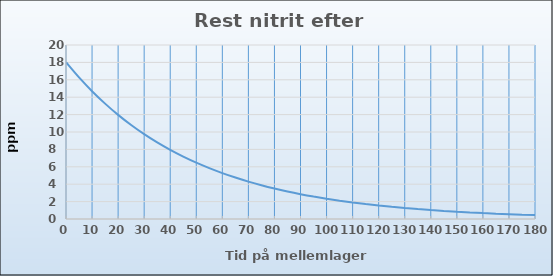
| Category | Series 0 |
|---|---|
| 0.0 | 18.028 |
| 5.0 | 16.273 |
| 10.0 | 14.69 |
| 15.0 | 13.26 |
| 20.0 | 11.97 |
| 25.0 | 10.805 |
| 30.0 | 9.754 |
| 35.0 | 8.805 |
| 40.0 | 7.948 |
| 45.0 | 7.175 |
| 50.0 | 6.476 |
| 55.0 | 5.846 |
| 60.0 | 5.277 |
| 65.0 | 4.764 |
| 70.0 | 4.3 |
| 75.0 | 3.882 |
| 80.0 | 3.504 |
| 85.0 | 3.163 |
| 90.0 | 2.855 |
| 95.0 | 2.577 |
| 100.0 | 2.327 |
| 105.0 | 2.1 |
| 110.0 | 1.896 |
| 115.0 | 1.711 |
| 120.0 | 1.545 |
| 125.0 | 1.395 |
| 130.0 | 1.259 |
| 135.0 | 1.136 |
| 140.0 | 1.026 |
| 145.0 | 0.926 |
| 150.0 | 0.836 |
| 155.0 | 0.755 |
| 160.0 | 0.681 |
| 165.0 | 0.615 |
| 170.0 | 0.555 |
| 175.0 | 0.501 |
| 180.0 | 0.452 |
| 185.0 | 0.408 |
| 190.0 | 0.369 |
| 195.0 | 0.333 |
| 200.0 | 0.3 |
| 205.0 | 0.271 |
| 210.0 | 0.245 |
| 215.0 | 0.221 |
| 220.0 | 0.199 |
| 225.0 | 0.18 |
| 230.0 | 0.162 |
| 235.0 | 0.147 |
| 240.0 | 0.132 |
| 245.0 | 0.12 |
| 250.0 | 0.108 |
| 255.0 | 0.097 |
| 260.0 | 0.088 |
| 265.0 | 0.079 |
| 270.0 | 0.072 |
| 275.0 | 0.065 |
| 280.0 | 0.058 |
| 285.0 | 0.053 |
| 290.0 | 0.048 |
| 295.0 | 0.043 |
| 300.0 | 0.039 |
| 305.0 | 0.035 |
| 310.0 | 0.032 |
| 315.0 | 0.029 |
| 320.0 | 0.026 |
| 325.0 | 0.023 |
| 330.0 | 0.021 |
| 335.0 | 0.019 |
| 340.0 | 0.017 |
| 345.0 | 0.015 |
| 350.0 | 0.014 |
| 355.0 | 0.013 |
| 360.0 | 0.011 |
| 365.0 | 0.01 |